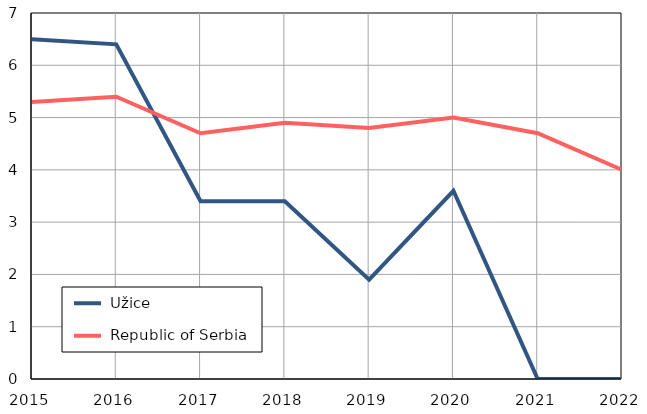
| Category |  Užice |  Republic of Serbia |
|---|---|---|
| 2015.0 | 6.5 | 5.3 |
| 2016.0 | 6.4 | 5.4 |
| 2017.0 | 3.4 | 4.7 |
| 2018.0 | 3.4 | 4.9 |
| 2019.0 | 1.9 | 4.8 |
| 2020.0 | 3.6 | 5 |
| 2021.0 | 0 | 4.7 |
| 2022.0 | 0 | 4 |